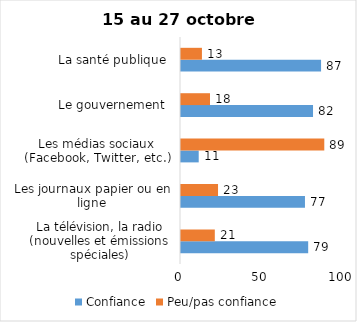
| Category | Confiance | Peu/pas confiance |
|---|---|---|
| La télévision, la radio (nouvelles et émissions spéciales) | 79 | 21 |
| Les journaux papier ou en ligne | 77 | 23 |
| Les médias sociaux (Facebook, Twitter, etc.) | 11 | 89 |
| Le gouvernement  | 82 | 18 |
| La santé publique  | 87 | 13 |